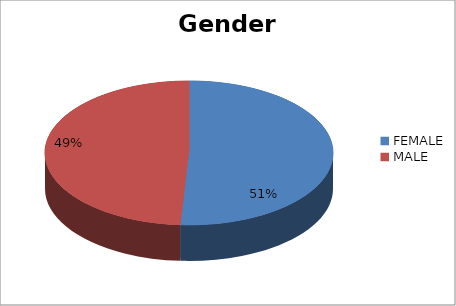
| Category | Series 0 |
|---|---|
| FEMALE | 0.509 |
| MALE | 0.491 |